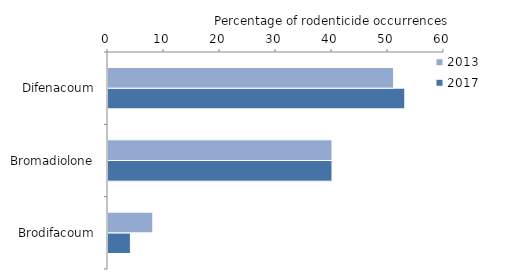
| Category | 2017 | 2013 |
|---|---|---|
| Brodifacoum | 4 | 8 |
| Bromadiolone | 40 | 40 |
| Difenacoum | 53 | 51 |